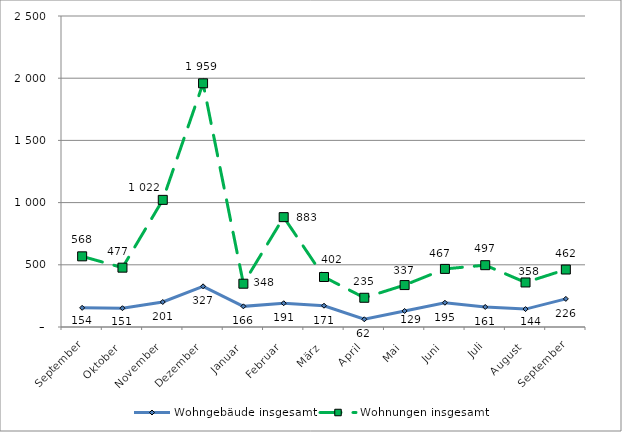
| Category | Wohngebäude insgesamt | Wohnungen insgesamt |
|---|---|---|
| September | 154 | 568 |
| Oktober | 151 | 477 |
| November | 201 | 1022 |
| Dezember | 327 | 1959 |
| Januar | 166 | 348 |
| Februar | 191 | 883 |
| März | 171 | 402 |
| April | 62 | 235 |
| Mai | 129 | 337 |
| Juni | 195 | 467 |
| Juli | 161 | 497 |
| August | 144 | 358 |
| September | 226 | 462 |